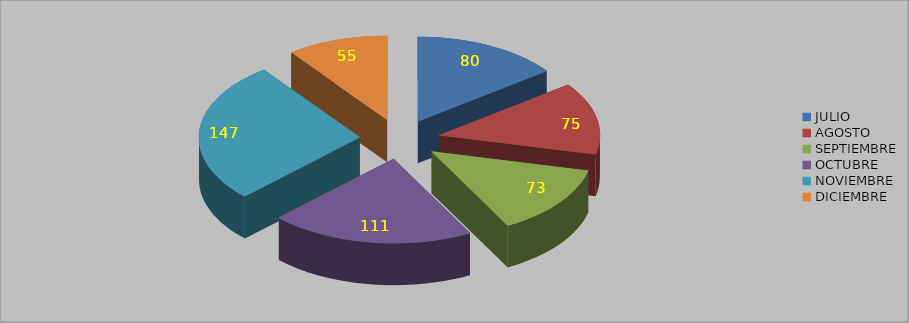
| Category | Series 0 | Series 1 | Series 2 | Series 3 | Series 4 | Series 5 | Series 6 | Series 7 |
|---|---|---|---|---|---|---|---|---|
| JULIO | 80 | 75 | 34 | 6 | 53 | 6 | 28 | 29 |
| AGOSTO | 75 | 74 | 26 | 10 | 88 | 4 | 26 | 35 |
| SEPTIEMBRE | 73 | 59 | 20 | 5 | 69 | 7 | 20 | 34 |
| OCTUBRE | 111 | 120 | 19 | 13 | 65 | 10 | 7 | 34 |
| NOVIEMBRE | 147 | 111 | 12 | 14 | 59 | 6 | 17 | 32 |
| DICIEMBRE | 55 | 75 | 12 | 5 | 26 | 1 | 5 | 20 |